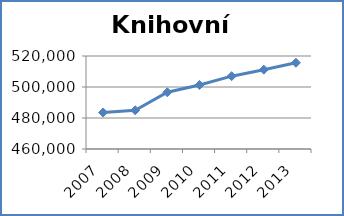
| Category | Knihovní fond |
|---|---|
| 2007.0 | 483554 |
| 2008.0 | 484976 |
| 2009.0 | 496596 |
| 2010.0 | 501317 |
| 2011.0 | 506986 |
| 2012.0 | 511189 |
| 2013.0 | 515645 |